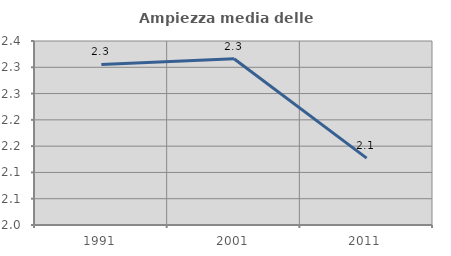
| Category | Ampiezza media delle famiglie |
|---|---|
| 1991.0 | 2.305 |
| 2001.0 | 2.316 |
| 2011.0 | 2.127 |